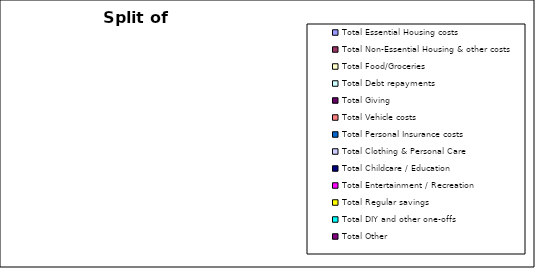
| Category | Series 0 |
|---|---|
| Total Essential Housing costs | 0 |
| Total Non-Essential Housing & other costs | 0 |
| Total Food/Groceries | 0 |
| Total Debt repayments | 0 |
| Total Giving | 0 |
| Total Vehicle costs | 0 |
| Total Personal Insurance costs | 0 |
| Total Clothing & Personal Care | 0 |
| Total Childcare / Education | 0 |
| Total Entertainment / Recreation | 0 |
| Total Regular savings | 0 |
| Total DIY and other one-offs | 0 |
| Total Other | 0 |